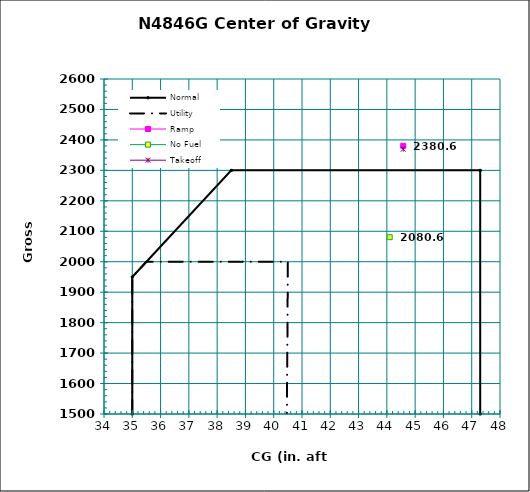
| Category | Normal |
|---|---|
| 35.0 | 1500 |
| 35.0 | 1950 |
| 38.5 | 2300 |
| 47.3 | 2300 |
| 47.3 | 1500 |